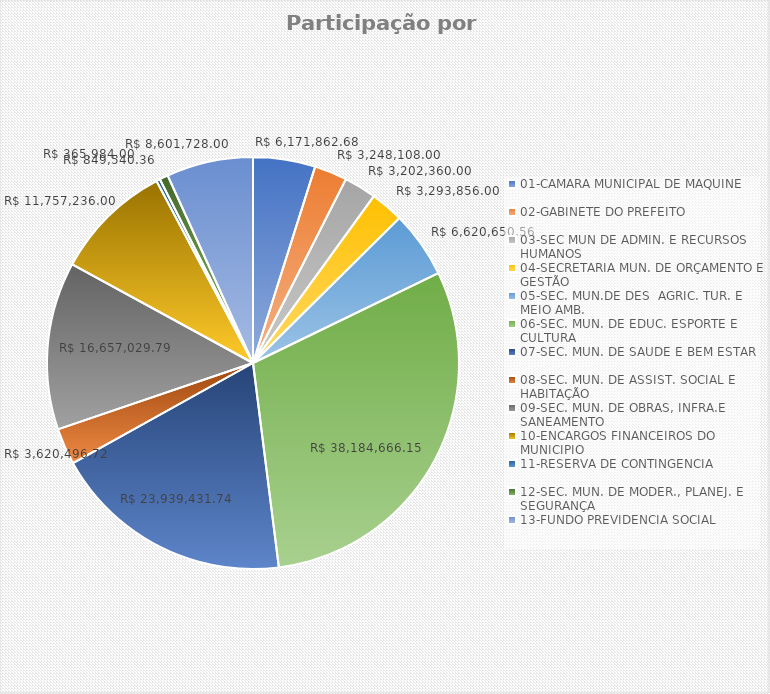
| Category | Series 0 | Series 1 | Series 2 | Series 3 |
|---|---|---|---|---|
| 01-CAMARA MUNICIPAL DE MAQUINE |  |  |  | 6171862.68 |
| 02-GABINETE DO PREFEITO |  |  |  | 3248108 |
| 03-SEC MUN DE ADMIN. E RECURSOS HUMANOS |  |  |  | 3202360 |
| 04-SECRETARIA MUN. DE ORÇAMENTO E GESTÃO |  |  |  | 3293856 |
| 05-SEC. MUN.DE DES  AGRIC. TUR. E MEIO AMB. |  |  |  | 6620650.56 |
| 06-SEC. MUN. DE EDUC. ESPORTE E CULTURA |  |  |  | 38184666.15 |
| 07-SEC. MUN. DE SAUDE E BEM ESTAR |  |  |  | 23939431.74 |
| 08-SEC. MUN. DE ASSIST. SOCIAL E HABITAÇÃO |  |  |  | 3620496.72 |
| 09-SEC. MUN. DE OBRAS, INFRA.E SANEAMENTO  |  |  |  | 16657029.79 |
| 10-ENCARGOS FINANCEIROS DO MUNICIPIO |  |  |  | 11757236 |
| 11-RESERVA DE CONTINGENCIA  |  |  |  | 365984 |
| 12-SEC. MUN. DE MODER., PLANEJ. E SEGURANÇA |  |  |  | 849540.36 |
| 13-FUNDO PREVIDENCIA SOCIAL |  |  |  | 8601728 |